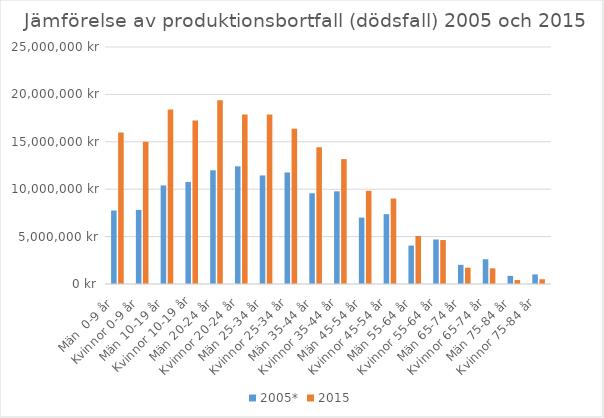
| Category | 2005* | 2015 |
|---|---|---|
| Män  0-9 år  | 7751501 | 15988139.334 |
| Kvinnor 0-9 år  | 7814338 | 15008981.524 |
| Män 10-19 år  | 10400468 | 18414636.821 |
| Kvinnor 10-19 år | 10768949 | 17238813.309 |
| Män 20-24 år  | 11998035 | 19383757.081 |
| Kvinnor 20-24 år  | 12412305 | 17867521.857 |
| Män 25-34 år  | 11450705 | 17886372.307 |
| Kvinnor 25-34 år  | 11764084 | 16370194.667 |
| Män 35-44 år  | 9570100 | 14438071.726 |
| Kvinnor 35-44 år  | 9777215 | 13172106.719 |
| Män 45-54 år  | 7002848 | 9830219.476 |
| Kvinnor 45-54 år  | 7366343 | 9019311.006 |
| Män 55-64 år  | 4052514 | 5060751.447 |
| Kvinnor 55-64 år  | 4698674 | 4637766.322 |
| Män 65-74 år  | 2019803 | 1722892.24 |
| Kvinnor 65-74 år  | 2612682 | 1651954.346 |
| Män 75-84 år  | 857438 | 416055.947 |
| Kvinnor 75-84 år  | 1009389 | 502044.287 |